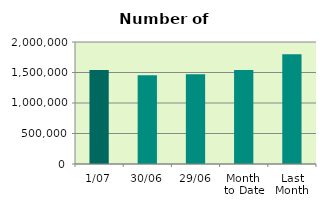
| Category | Series 0 |
|---|---|
| 1/07 | 1540834 |
| 30/06 | 1456470 |
| 29/06 | 1471222 |
| Month 
to Date | 1540834 |
| Last
Month | 1799890 |